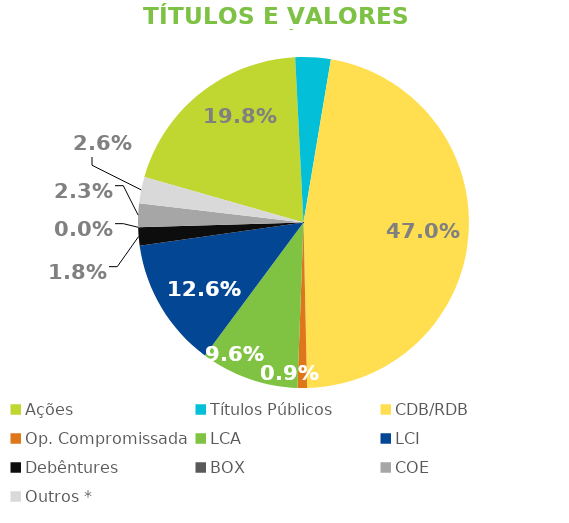
| Category | TVM |
|---|---|
| Ações | 0.198 |
| Títulos Públicos | 0.035 |
| CDB/RDB | 0.47 |
| Op. Compromissada | 0.009 |
| LCA | 0.096 |
| LCI | 0.126 |
| Debêntures | 0.018 |
| BOX | 0 |
| COE | 0.023 |
| Outros * | 0.026 |